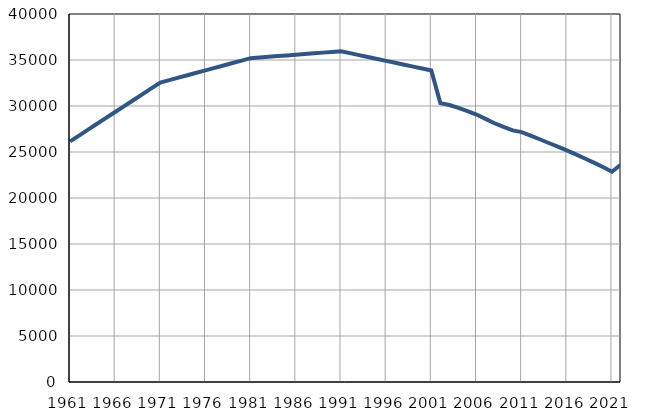
| Category | Population
size |
|---|---|
| 1961.0 | 26147 |
| 1962.0 | 26788 |
| 1963.0 | 27427 |
| 1964.0 | 28067 |
| 1965.0 | 28707 |
| 1966.0 | 29348 |
| 1967.0 | 29988 |
| 1968.0 | 30628 |
| 1969.0 | 31268 |
| 1970.0 | 31908 |
| 1971.0 | 32548 |
| 1972.0 | 32813 |
| 1973.0 | 33078 |
| 1974.0 | 33344 |
| 1975.0 | 33609 |
| 1976.0 | 33874 |
| 1977.0 | 34139 |
| 1978.0 | 34404 |
| 1979.0 | 34670 |
| 1980.0 | 34935 |
| 1981.0 | 35200 |
| 1982.0 | 35275 |
| 1983.0 | 35350 |
| 1984.0 | 35425 |
| 1985.0 | 35500 |
| 1986.0 | 35575 |
| 1987.0 | 35651 |
| 1988.0 | 35725 |
| 1989.0 | 35801 |
| 1990.0 | 35876 |
| 1991.0 | 35951 |
| 1992.0 | 35743 |
| 1993.0 | 35534 |
| 1994.0 | 35326 |
| 1995.0 | 35117 |
| 1996.0 | 34908 |
| 1997.0 | 34701 |
| 1998.0 | 34492 |
| 1999.0 | 34283 |
| 2000.0 | 34075 |
| 2001.0 | 33866 |
| 2002.0 | 30313 |
| 2003.0 | 30104 |
| 2004.0 | 29793 |
| 2005.0 | 29447 |
| 2006.0 | 29070 |
| 2007.0 | 28603 |
| 2008.0 | 28122 |
| 2009.0 | 27730 |
| 2010.0 | 27349 |
| 2011.0 | 27166 |
| 2012.0 | 26770 |
| 2013.0 | 26386 |
| 2014.0 | 25979 |
| 2015.0 | 25583 |
| 2016.0 | 25171 |
| 2017.0 | 24745 |
| 2018.0 | 24299 |
| 2019.0 | 23847 |
| 2020.0 | 23373 |
| 2021.0 | 22857 |
| 2022.0 | 23647 |